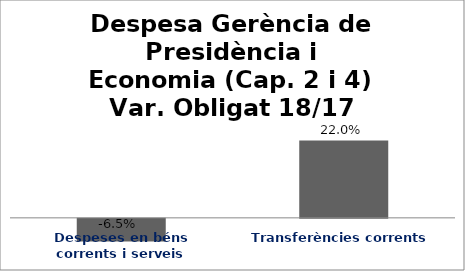
| Category | Series 0 |
|---|---|
| Despeses en béns corrents i serveis | -0.065 |
| Transferències corrents | 0.22 |